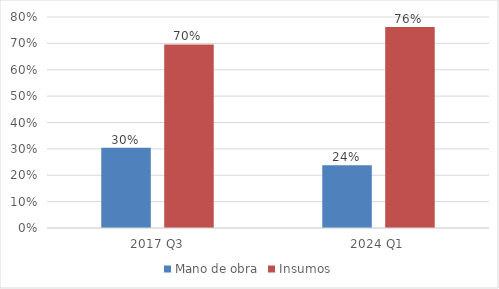
| Category | Mano de obra | Insumos |
|---|---|---|
| 2017 Q3 | 0.304 | 0.696 |
| 2024 Q1 | 0.238 | 0.762 |